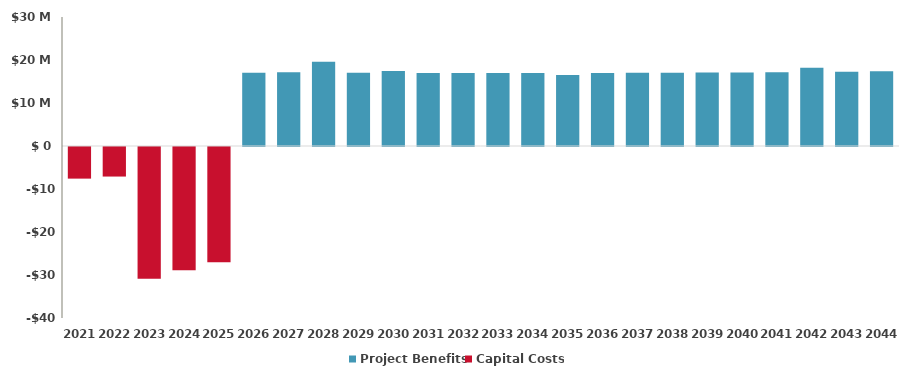
| Category | Project Benefits | Capital Costs |
|---|---|---|
| 2021.0 | 0 | -7354575.09 |
| 2022.0 | 0 | -6873434.664 |
| 2023.0 | 0 | -30668174.24 |
| 2024.0 | 0 | -28661845.084 |
| 2025.0 | 0 | -26786771.106 |
| 2026.0 | 17030149.107 | 0 |
| 2027.0 | 17168737.424 | 0 |
| 2028.0 | 19620138.612 | 0 |
| 2029.0 | 17062909.441 | 0 |
| 2030.0 | 17439903.869 | 0 |
| 2031.0 | 17004188.873 | 0 |
| 2032.0 | 16996484.353 | 0 |
| 2033.0 | 16976691.422 | 0 |
| 2034.0 | 16975161.65 | 0 |
| 2035.0 | 16506302.279 | 0 |
| 2036.0 | 16996310.758 | 0 |
| 2037.0 | 17024837.503 | 0 |
| 2038.0 | 17045835.701 | 0 |
| 2039.0 | 17080914.241 | 0 |
| 2040.0 | 17092854.606 | 0 |
| 2041.0 | 17171397.127 | 0 |
| 2042.0 | 18207823.555 | 0 |
| 2043.0 | 17291202.232 | 0 |
| 2044.0 | 17359397.354 | 0 |